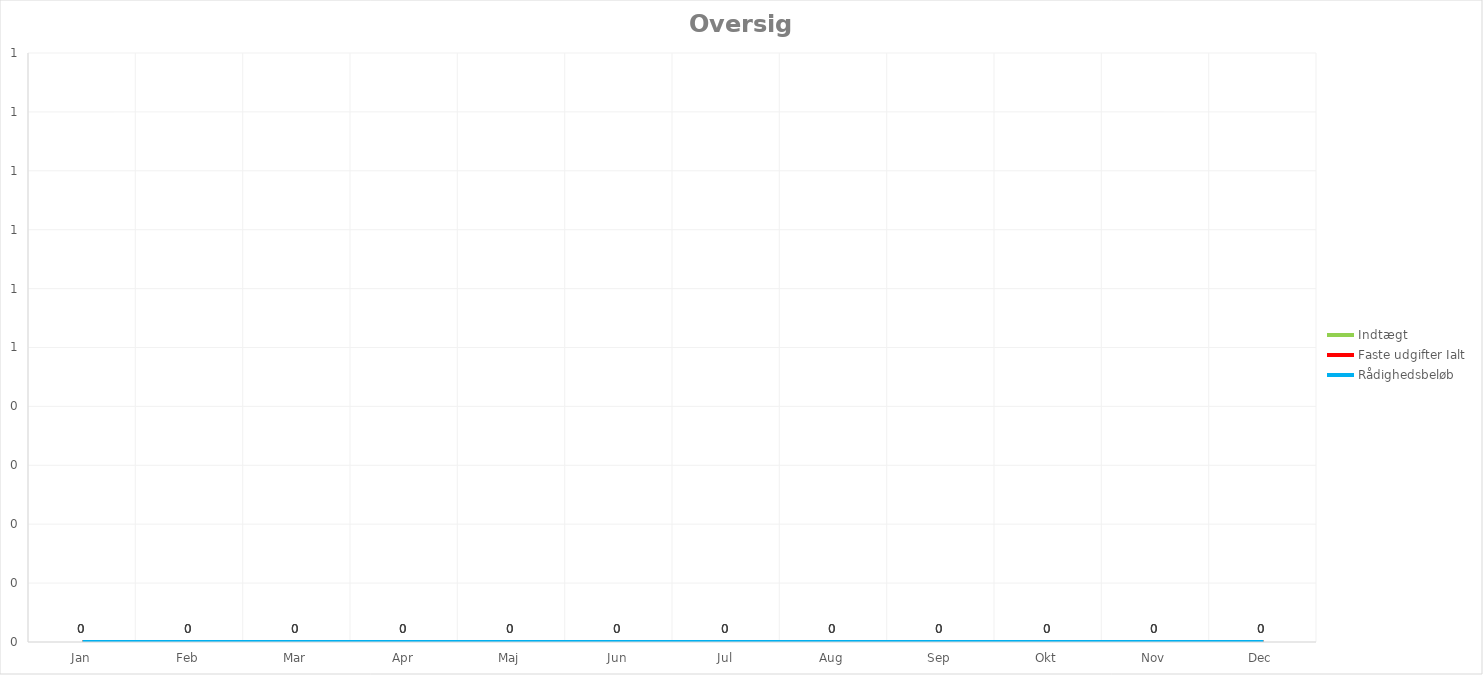
| Category | Indtægt | Faste udgifter Ialt | Rådighedsbeløb |
|---|---|---|---|
| Jan | 0 | 0 | 0 |
| Feb | 0 | 0 | 0 |
| Mar | 0 | 0 | 0 |
| Apr | 0 | 0 | 0 |
| Maj | 0 | 0 | 0 |
| Jun | 0 | 0 | 0 |
| Jul | 0 | 0 | 0 |
| Aug | 0 | 0 | 0 |
| Sep | 0 | 0 | 0 |
| Okt | 0 | 0 | 0 |
| Nov | 0 | 0 | 0 |
| Dec | 0 | 0 | 0 |